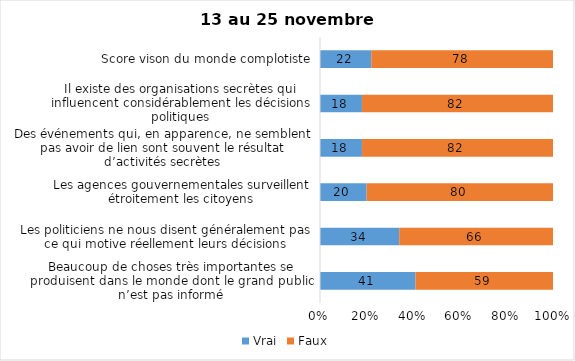
| Category | Vrai | Faux |
|---|---|---|
| Beaucoup de choses très importantes se produisent dans le monde dont le grand public n’est pas informé | 41 | 59 |
| Les politiciens ne nous disent généralement pas ce qui motive réellement leurs décisions | 34 | 66 |
| Les agences gouvernementales surveillent étroitement les citoyens | 20 | 80 |
| Des événements qui, en apparence, ne semblent pas avoir de lien sont souvent le résultat d’activités secrètes | 18 | 82 |
| Il existe des organisations secrètes qui influencent considérablement les décisions politiques | 18 | 82 |
| Score vison du monde complotiste | 22 | 78 |